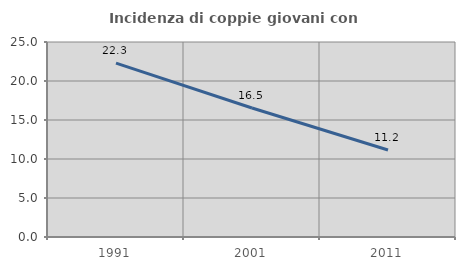
| Category | Incidenza di coppie giovani con figli |
|---|---|
| 1991.0 | 22.295 |
| 2001.0 | 16.535 |
| 2011.0 | 11.153 |